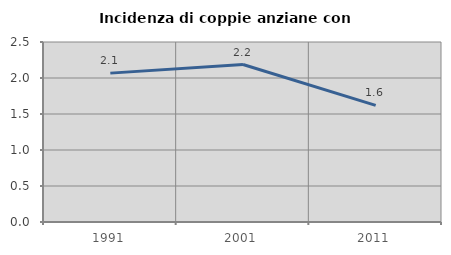
| Category | Incidenza di coppie anziane con figli |
|---|---|
| 1991.0 | 2.068 |
| 2001.0 | 2.188 |
| 2011.0 | 1.619 |